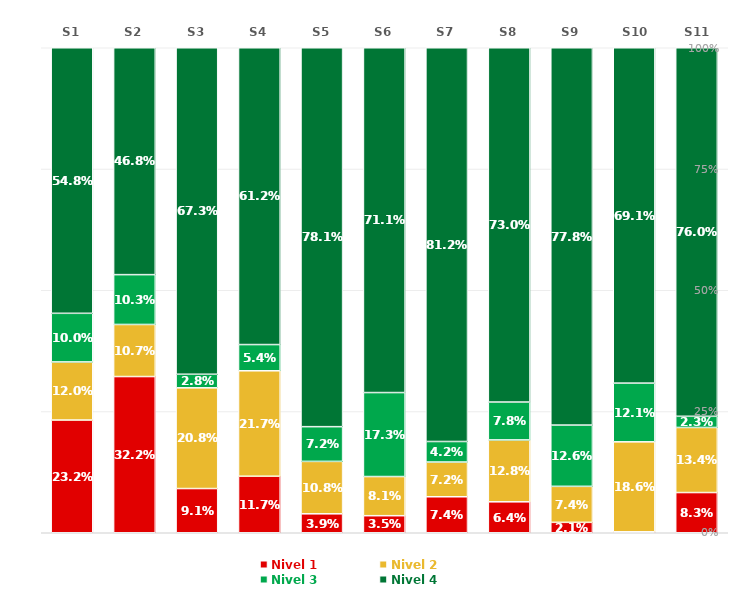
| Category | Nivel 1 | Nivel 2 | Nivel 3 | Nivel 4 |
|---|---|---|---|---|
| S1 | 0.232 | 0.12 | 0.1 | 0.548 |
| S2 | 0.322 | 0.107 | 0.103 | 0.468 |
| S3 | 0.091 | 0.208 | 0.028 | 0.673 |
| S4 | 0.117 | 0.217 | 0.054 | 0.612 |
| S5 | 0.039 | 0.108 | 0.072 | 0.781 |
| S6 | 0.035 | 0.081 | 0.173 | 0.711 |
| S7 | 0.074 | 0.072 | 0.042 | 0.812 |
| S8 | 0.064 | 0.128 | 0.078 | 0.73 |
| S9 | 0.021 | 0.074 | 0.126 | 0.778 |
| S10 | 0.002 | 0.186 | 0.121 | 0.691 |
| S11 | 0.083 | 0.134 | 0.023 | 0.76 |